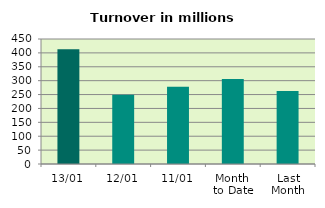
| Category | Series 0 |
|---|---|
| 13/01 | 413.355 |
| 12/01 | 249.558 |
| 11/01 | 277.972 |
| Month 
to Date | 305.61 |
| Last
Month | 263.133 |